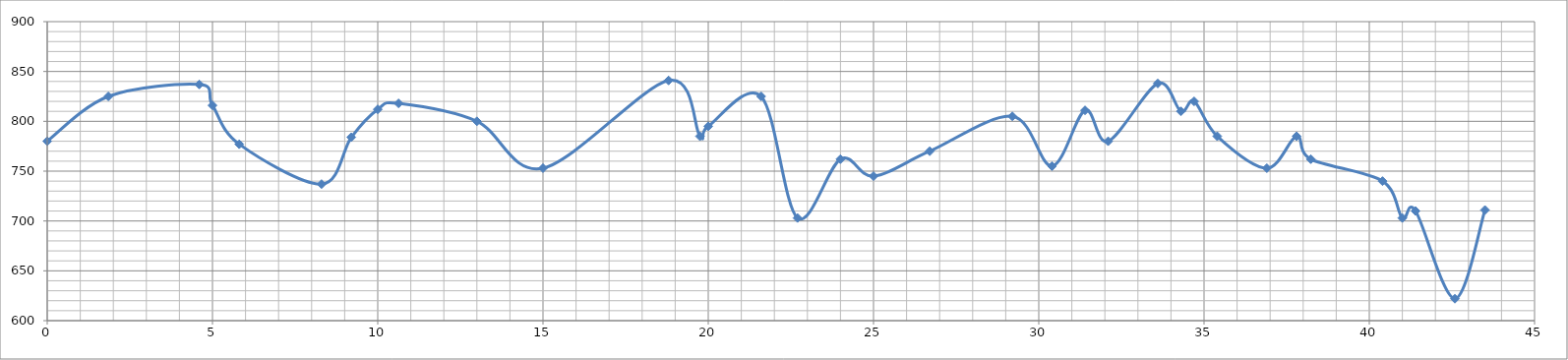
| Category | Series 0 |
|---|---|
| 0.0 | 780 |
| 1.85 | 825 |
| 4.6 | 837 |
| 5.0 | 816 |
| 5.81 | 777 |
| 8.3 | 737 |
| 9.2 | 784 |
| 10.0 | 812 |
| 10.63 | 818 |
| 13.0 | 800 |
| 15.0 | 753 |
| 18.8 | 841 |
| 19.75 | 785 |
| 20.0 | 795 |
| 21.6 | 825 |
| 22.7 | 703 |
| 24.0 | 762 |
| 25.0 | 745 |
| 26.7 | 770 |
| 29.2 | 805 |
| 30.4 | 755 |
| 31.4 | 811 |
| 32.1 | 780 |
| 33.6 | 838 |
| 34.3 | 810 |
| 34.7 | 820 |
| 35.4 | 785 |
| 36.9 | 753 |
| 37.8 | 785 |
| 38.23 | 762 |
| 40.4 | 740 |
| 41.0 | 703 |
| 41.4 | 710 |
| 42.59 | 622 |
| 43.5 | 711 |